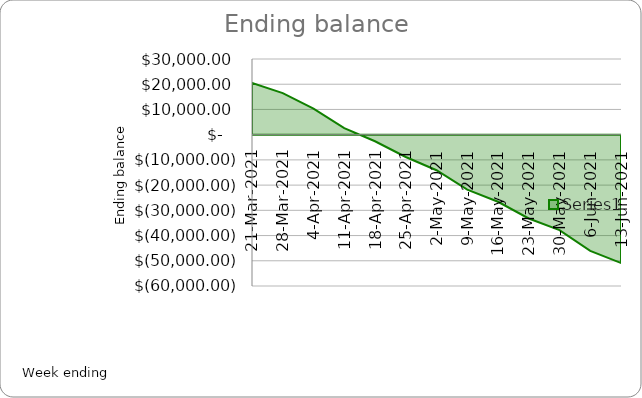
| Category | Series 0 |
|---|---|
| 2021-03-21 | 20537.349 |
| 2021-03-28 | 16453.561 |
| 2021-04-04 | 10335.59 |
| 2021-04-11 | 2597.802 |
| 2021-04-18 | -2611.319 |
| 2021-04-25 | -8855.107 |
| 2021-05-02 | -14094.228 |
| 2021-05-09 | -21784.016 |
| 2021-05-16 | -26601.137 |
| 2021-05-23 | -33236.924 |
| 2021-05-30 | -37824.046 |
| 2021-06-06 | -46063.833 |
| 2021-06-13 | -50880.954 |